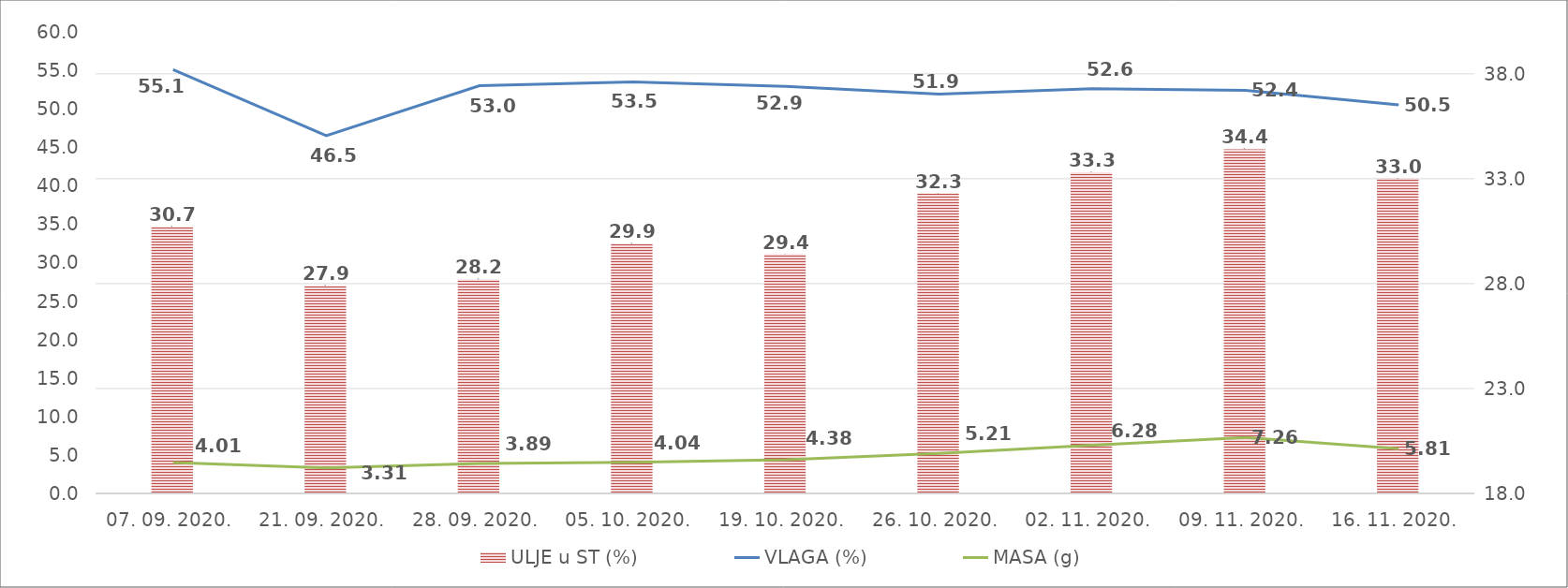
| Category | ULJE u ST (%) |
|---|---|
| 07. 09. 2020. | 30.7 |
| 21. 09. 2020. | 27.9 |
| 28. 09. 2020. | 28.2 |
| 05. 10. 2020. | 29.9 |
| 19. 10. 2020. | 29.4 |
| 26. 10. 2020. | 32.3 |
| 02. 11. 2020. | 33.3 |
| 09. 11. 2020. | 34.4 |
| 16. 11. 2020. | 33 |